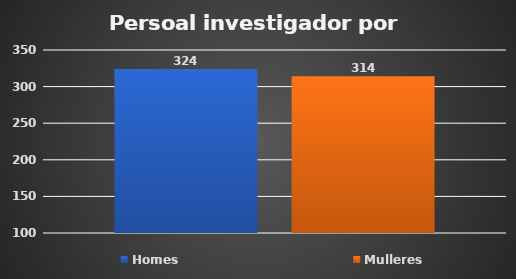
| Category | Homes | Mulleres |
|---|---|---|
| 0 | 324 | 314 |